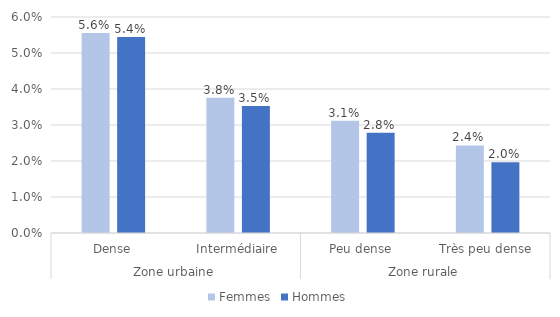
| Category | Femmes | Hommes |
|---|---|---|
| 0 | 0.056 | 0.054 |
| 1 | 0.038 | 0.035 |
| 2 | 0.031 | 0.028 |
| 3 | 0.024 | 0.02 |